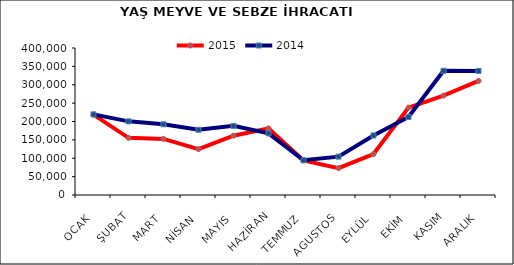
| Category | 2015 | 2014 |
|---|---|---|
| OCAK | 218501.914 | 219372.686 |
| ŞUBAT | 155554.297 | 200366.002 |
| MART | 152632.426 | 192353.526 |
| NİSAN | 124853.161 | 177392.704 |
| MAYIS | 161378.328 | 188104.702 |
| HAZİRAN | 181193.736 | 167816.563 |
| TEMMUZ | 93843.734 | 94578.114 |
| AGUSTOS | 73244.346 | 104381.065 |
| EYLÜL | 111368.162 | 162033.476 |
| EKİM | 237673.329 | 212300.09 |
| KASIM | 270539.043 | 338022 |
| ARALIK | 310530.56 | 337593.838 |